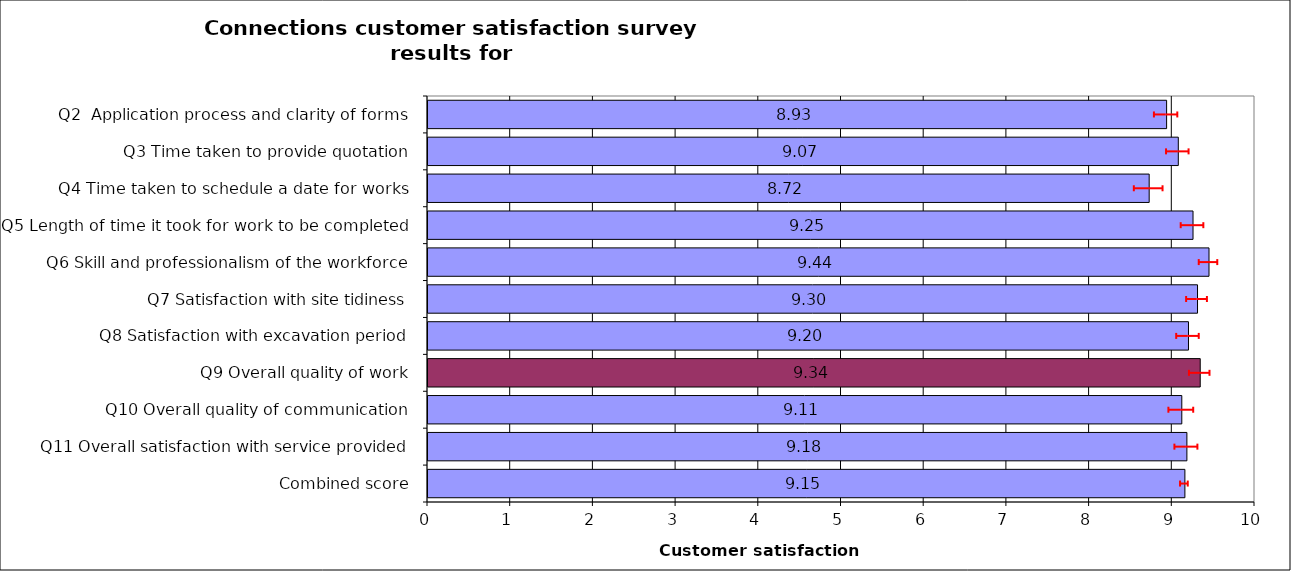
| Category | Series 0 |
|---|---|
| Q2  Application process and clarity of forms | 8.931 |
| Q3 Time taken to provide quotation | 9.073 |
| Q4 Time taken to schedule a date for works | 8.72 |
| Q5 Length of time it took for work to be completed | 9.25 |
| Q6 Skill and professionalism of the workforce | 9.444 |
| Q7 Satisfaction with site tidiness | 9.305 |
| Q8 Satisfaction with excavation period | 9.196 |
| Q9 Overall quality of work | 9.338 |
| Q10 Overall quality of communication | 9.115 |
| Q11 Overall satisfaction with service provided | 9.177 |
| Combined score | 9.152 |